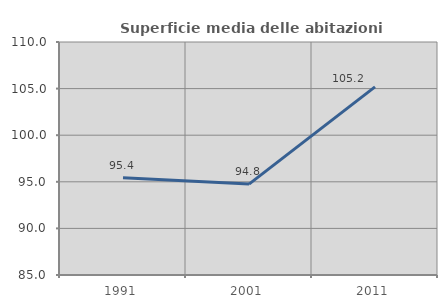
| Category | Superficie media delle abitazioni occupate |
|---|---|
| 1991.0 | 95.439 |
| 2001.0 | 94.755 |
| 2011.0 | 105.183 |